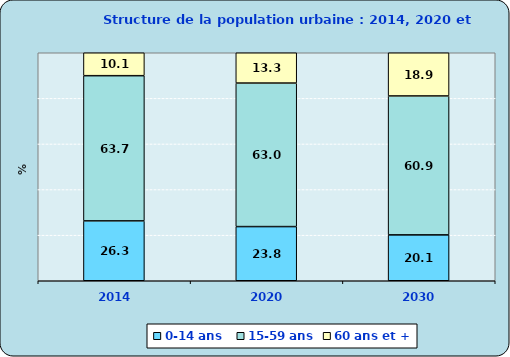
| Category | 0-14 ans  | 15-59 ans | 60 ans et + |
|---|---|---|---|
| 2014.0 | 26.255 | 63.686 | 10.058 |
| 2020.0 | 23.755 | 62.954 | 13.291 |
| 2030.0 | 20.123 | 60.932 | 18.946 |